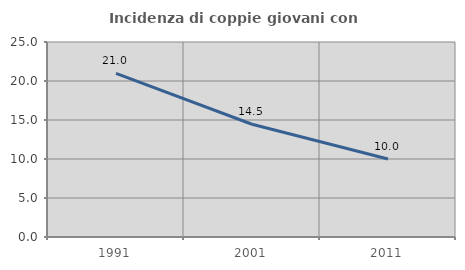
| Category | Incidenza di coppie giovani con figli |
|---|---|
| 1991.0 | 20.986 |
| 2001.0 | 14.451 |
| 2011.0 | 9.993 |